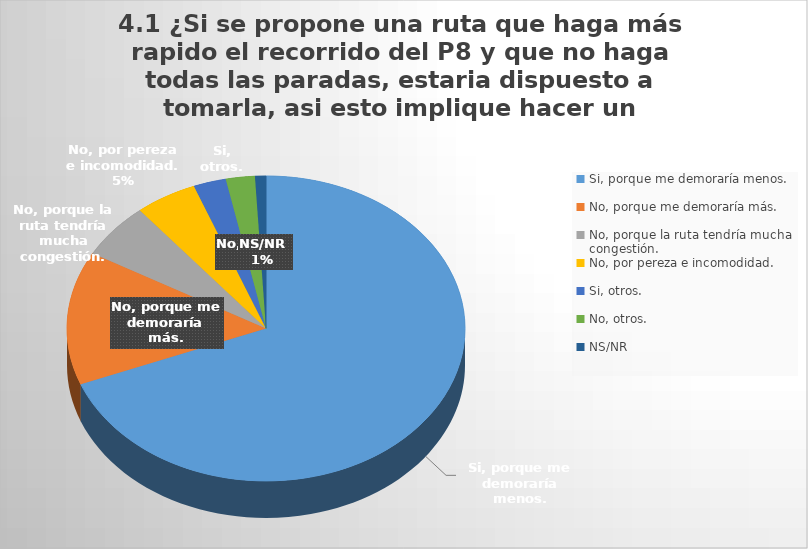
| Category | Series 0 |
|---|---|
| Si, porque me demoraría menos. | 234 |
| No, porque me demoraría más. | 48 |
| No, porque la ruta tendría mucha congestión. | 20 |
| No, por pereza e incomodidad. | 17 |
| Si, otros. | 9 |
| No, otros.  | 8 |
| NS/NR | 3 |